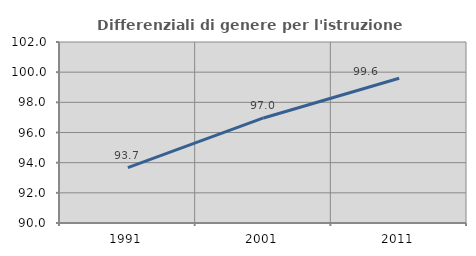
| Category | Differenziali di genere per l'istruzione superiore |
|---|---|
| 1991.0 | 93.676 |
| 2001.0 | 96.964 |
| 2011.0 | 99.594 |